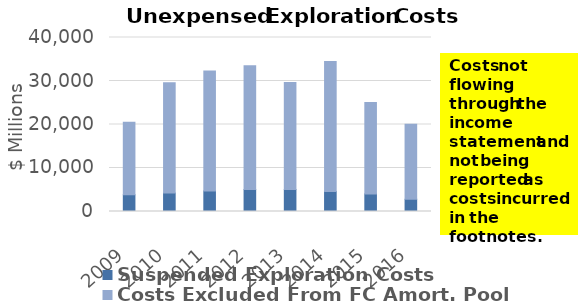
| Category | Suspended Exploration Costs | Costs Excluded From FC Amort. Pool |
|---|---|---|
| 2009 | 3836.206 | 16659 |
| 2010 | 4240.712 | 25351 |
| 2011 | 4715.306 | 27598 |
| 2012 | 5061.077 | 28419.888 |
| 2013 | 5065.356 | 24593.469 |
| 2014 | 4614.884 | 29855 |
| 2015 | 4051.711 | 21002 |
| 2016 | 2808.412 | 17226 |